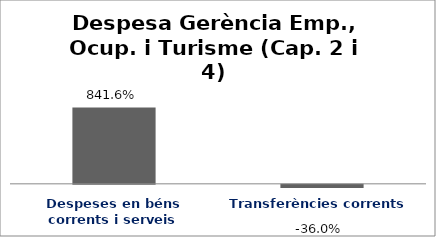
| Category | Series 0 |
|---|---|
| Despeses en béns corrents i serveis | 8.416 |
| Transferències corrents | -0.36 |